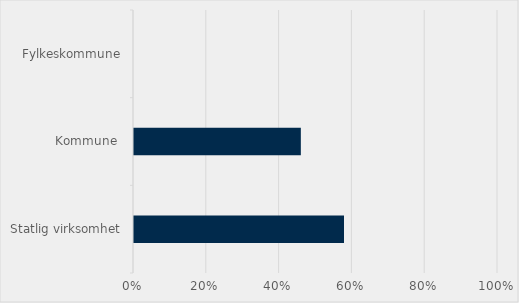
| Category | Series 0 |
|---|---|
| Statlig virksomhet | 0.577 |
| Kommune  | 0.458 |
| Fylkeskommune | 0 |